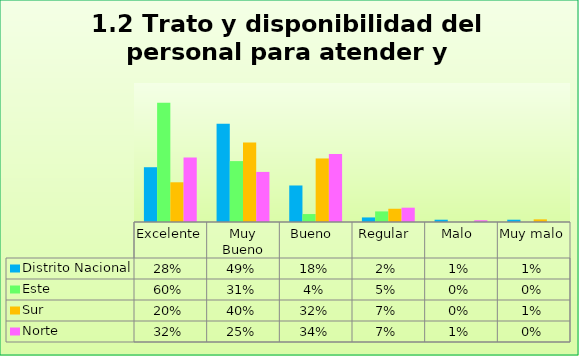
| Category | Distrito Nacional | Este | Sur  | Norte |
|---|---|---|---|---|
| Excelente | 0.276 | 0.6 | 0.2 | 0.324 |
| Muy Bueno | 0.494 | 0.307 | 0.4 | 0.252 |
| Bueno  | 0.184 | 0.04 | 0.32 | 0.342 |
| Regular  | 0.023 | 0.053 | 0.067 | 0.072 |
| Malo  | 0.011 | 0 | 0 | 0.009 |
| Muy malo  | 0.011 | 0 | 0.013 | 0 |